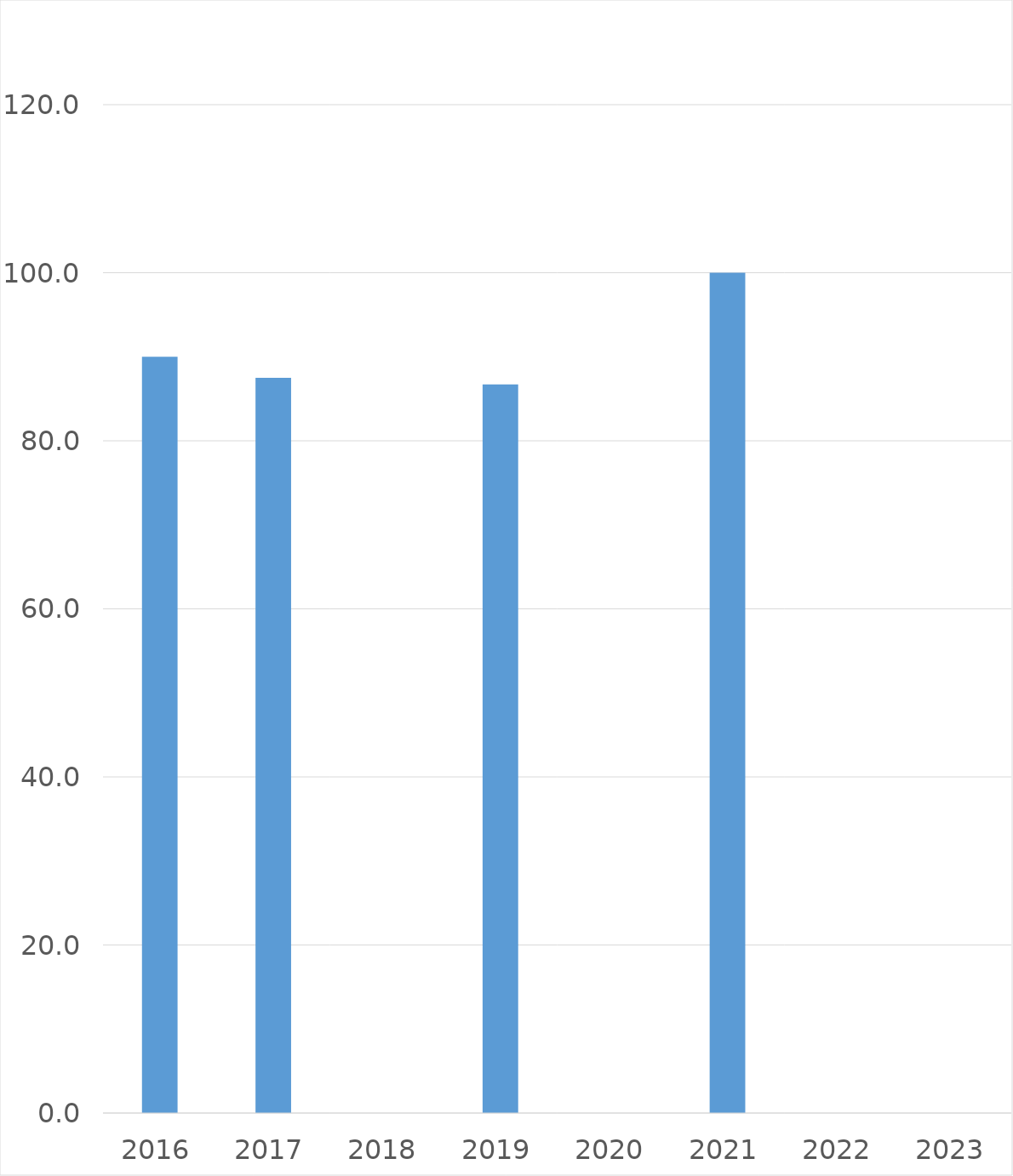
| Category | Series 0 |
|---|---|
| 2016 | 90 |
| 2017 | 87.5 |
| 2018 | 0 |
| 2019 | 86.7 |
| 2020 | 0 |
| 2021 | 100 |
| 2022 | 0 |
| 2023 | 0 |